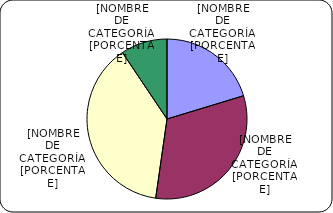
| Category | Series 0 |
|---|---|
| Entre 1-5 años | 2493.3 |
| Entre 6-10 años | 3923 |
| Entre 11-20 años | 4706.5 |
| Mayores de 20 años | 1155 |